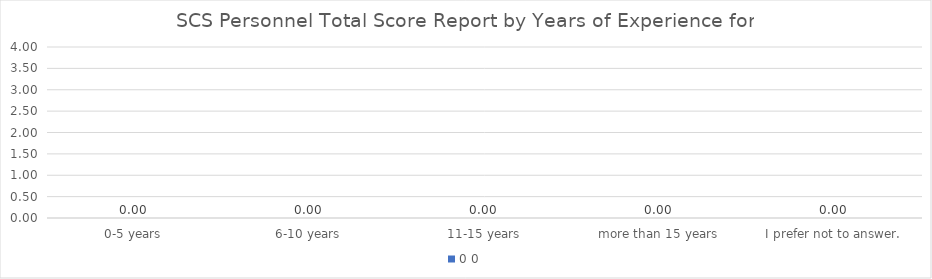
| Category | 0 |
|---|---|
| 0-5 years | 0 |
| 6-10 years | 0 |
| 11-15 years | 0 |
| more than 15 years | 0 |
| I prefer not to answer. | 0 |